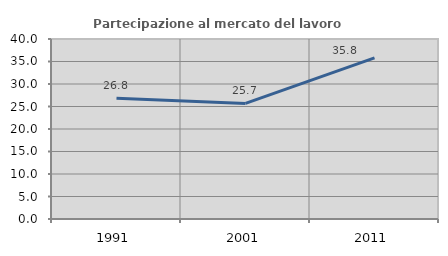
| Category | Partecipazione al mercato del lavoro  femminile |
|---|---|
| 1991.0 | 26.829 |
| 2001.0 | 25.681 |
| 2011.0 | 35.816 |